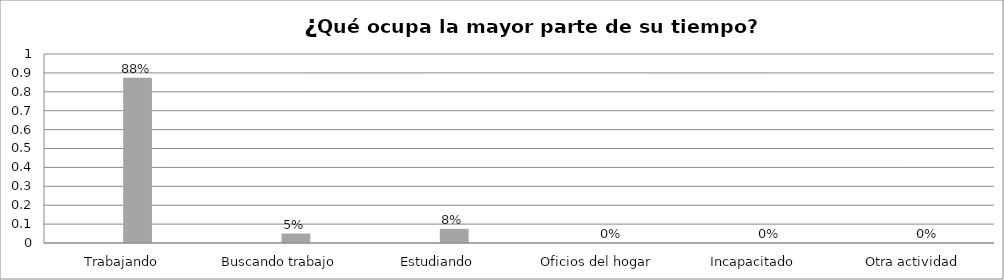
| Category | Series 0 | Series 1 | Series 2 | Series 3 |
|---|---|---|---|---|
| Trabajando |  |  | 0.875 |  |
| Buscando trabajo |  |  | 0.05 |  |
| Estudiando |  |  | 0.075 |  |
| Oficios del hogar |  |  | 0 |  |
| Incapacitado  |  |  | 0 |  |
| Otra actividad |  |  | 0 |  |